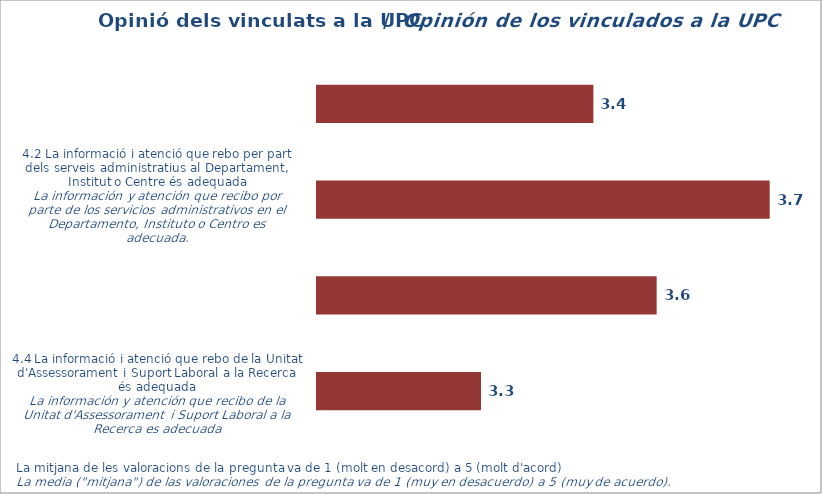
| Category | Mitjana |
|---|---|
| 1.0 | 3.449 |
| 2.0 | 3.736 |
| 3.0 | 3.552 |
| 4.0 | 3.267 |